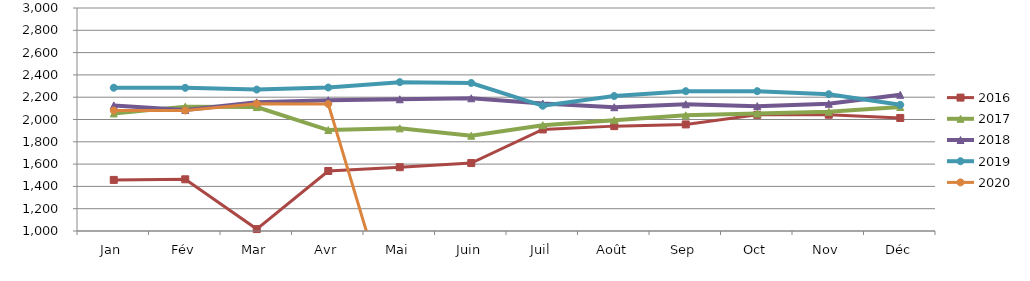
| Category | 2015 | 2016 | 2017 | 2018 | 2019 | 2020 |
|---|---|---|---|---|---|---|
| Jan |  | 1458.367 | 2054.548 | 2126.43 | 2285.077 | 2081.175 |
| Fév |  | 1463.569 | 2115.464 | 2086.116 | 2284.041 | 2081.178 |
| Mar |  | 1017.2 | 2111.342 | 2154.19 | 2268.401 | 2141.7 |
| Avr |  | 1538.072 | 1905.351 | 2172.692 | 2286.951 | 2138.761 |
| Mai |  | 1572.182 | 1920.479 | 2181.426 | 2334.869 | 0 |
| Juin |  | 1609.355 | 1854.713 | 2190.216 | 2327.493 | 0 |
| Juil |  | 1910.74 | 1949.204 | 2142.84 | 2123.041 | 0 |
| Août |  | 1940.578 | 1993.991 | 2110.076 | 2210.394 | 0 |
| Sep |  | 1955.778 | 2037.81 | 2137.072 | 2253.916 | 0 |
| Oct |  | 2041.667 | 2053.581 | 2119.873 | 2254.192 | 0 |
| Nov |  | 2042.699 | 2069.345 | 2140.872 | 2226.879 | 0 |
| Déc |  | 2013.752 | 2111.996 | 2221.568 | 2131.58 | 0 |